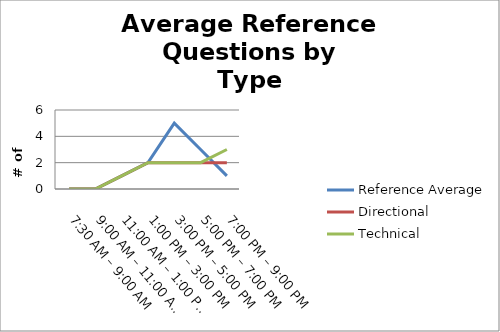
| Category | Reference Average | Directional | Technical |
|---|---|---|---|
| 7:30 AM – 9:00 AM | 0 | 0 | 0 |
| 9:00 AM – 11:00 AM | 0 | 0 | 0 |
| 11:00 AM – 1:00 PM | 1 | 1 | 1 |
| 1:00 PM – 3:00 PM | 2 | 2 | 2 |
| 3:00 PM – 5:00 PM | 5 | 2 | 2 |
| 5:00 PM – 7:00 PM | 3 | 2 | 2 |
| 7:00 PM – 9:00 PM | 1 | 2 | 3 |